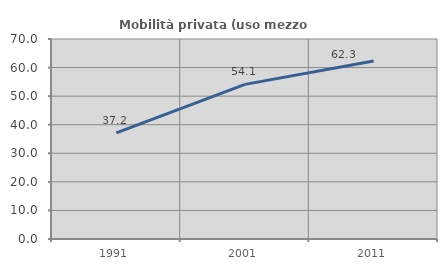
| Category | Mobilità privata (uso mezzo privato) |
|---|---|
| 1991.0 | 37.171 |
| 2001.0 | 54.121 |
| 2011.0 | 62.272 |